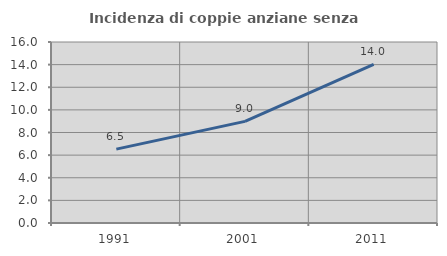
| Category | Incidenza di coppie anziane senza figli  |
|---|---|
| 1991.0 | 6.528 |
| 2001.0 | 8.985 |
| 2011.0 | 14.023 |